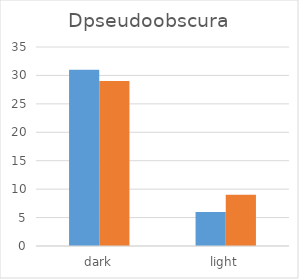
| Category | male | female |
|---|---|---|
| dark | 31 | 29 |
| light | 6 | 9 |